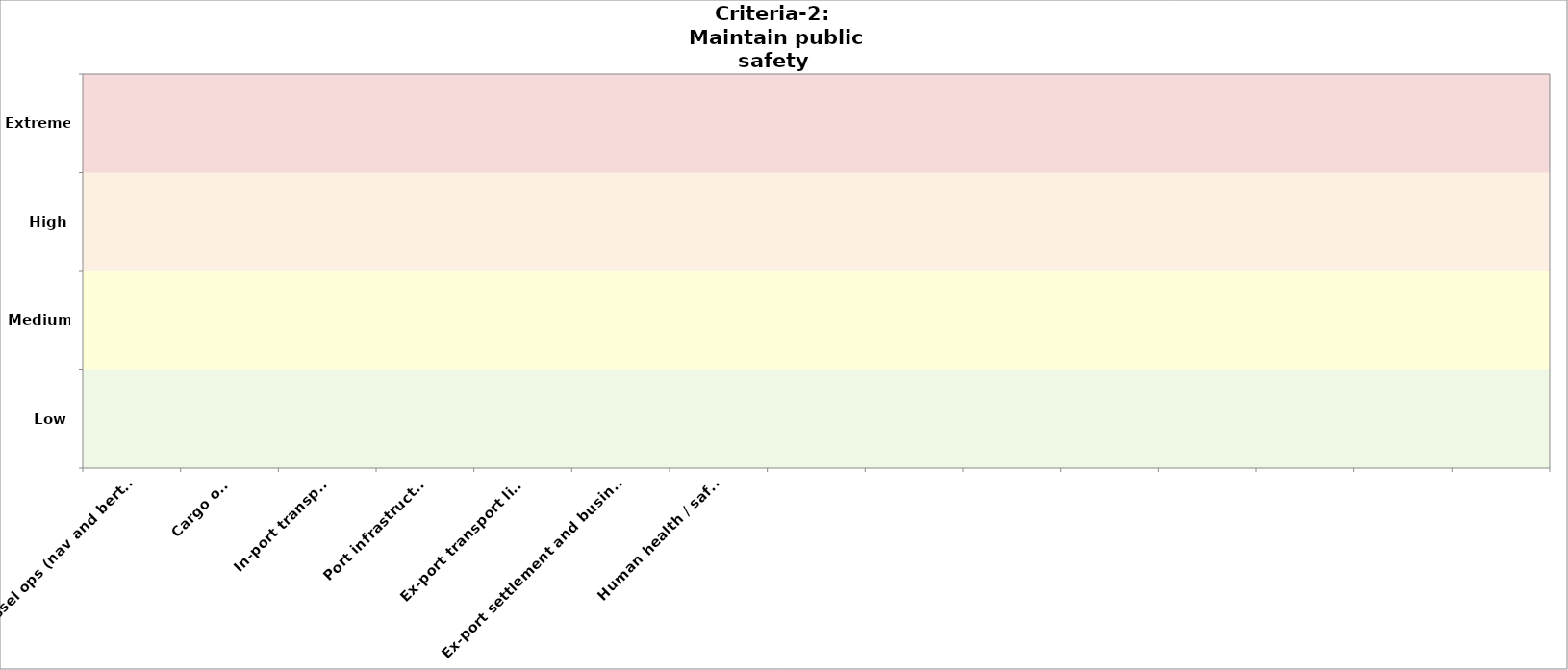
| Category | Criteria-2 
2050 |
|---|---|
| Vessel ops (nav and berthing) | 0 |
| Cargo ops | 0 |
| In-port transport | 0 |
| Port infrastructure | 0 |
| Ex-port transport links | 0 |
| Ex-port settlement and businesses | 0 |
| Human health / safety  | 0 |